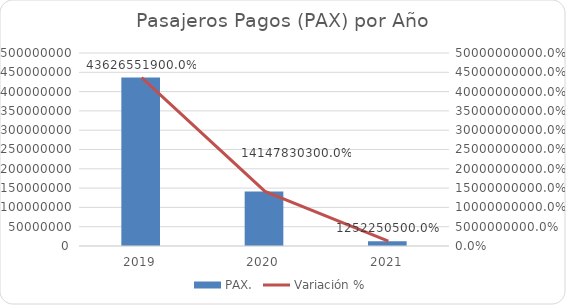
| Category | PAX. |
|---|---|
| 2019 | 436265519 |
| 2020 | 141478303 |
| 2021 | 12522505 |